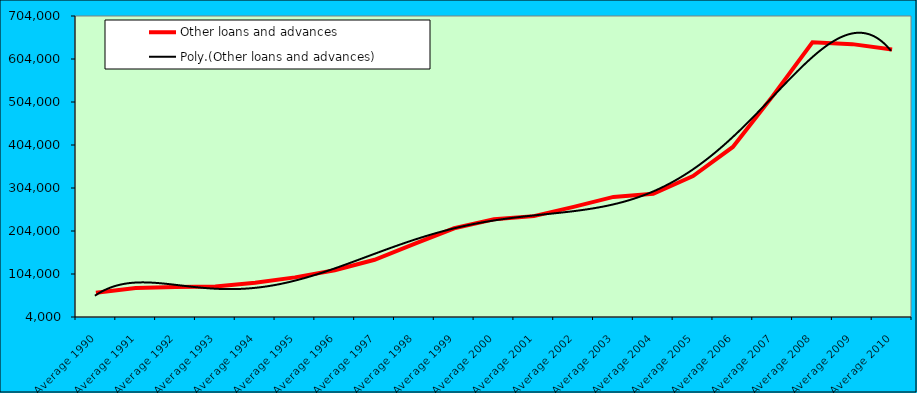
| Category | Other loans and advances |
|---|---|
| Average 1990 | 60359.25 |
| Average 1991 | 71693.667 |
| Average 1992 | 73763.083 |
| Average 1993 | 75123.5 |
| Average 1994 | 83583.167 |
| Average 1995 | 96156.25 |
| Average 1996 | 112671.5 |
| Average 1997 | 137051.333 |
| Average 1998 | 174201.333 |
| Average 1999 | 210321.909 |
| Average 2000 | 231208.333 |
| Average 2001 | 238603.455 |
| Average 2002 | 260087.583 |
| Average 2003 | 283225.333 |
| Average 2004 | 290516.667 |
| Average 2005 | 331649.833 |
| Average 2006 | 399517.583 |
| Average 2007 | 517626.5 |
| Average 2008 | 642976.083 |
| Average 2009 | 638565.667 |
| Average 2010 | 626277.714 |